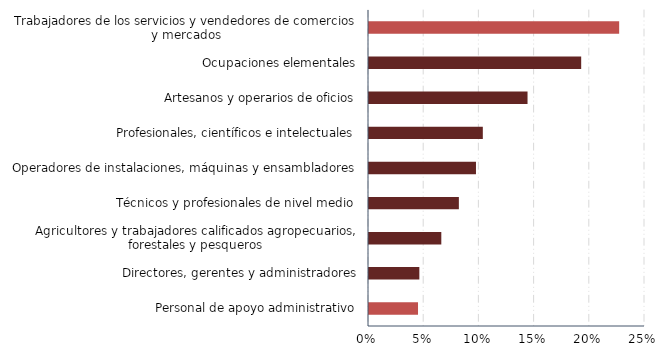
| Category | Series 0 |
|---|---|
| Personal de apoyo administrativo | 0.044 |
| Directores, gerentes y administradores | 0.046 |
| Agricultores y trabajadores calificados agropecuarios, forestales y pesqueros | 0.066 |
| Técnicos y profesionales de nivel medio | 0.081 |
| Operadores de instalaciones, máquinas y ensambladores | 0.097 |
| Profesionales, científicos e intelectuales | 0.103 |
| Artesanos y operarios de oficios | 0.144 |
| Ocupaciones elementales | 0.192 |
| Trabajadores de los servicios y vendedores de comercios y mercados | 0.227 |